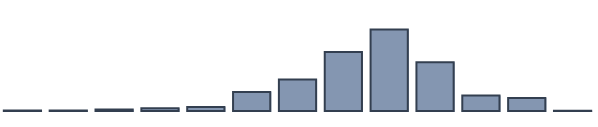
| Category | Series 0 |
|---|---|
| 0 | 0.169 |
| 1 | 0.136 |
| 2 | 0.545 |
| 3 | 0.969 |
| 4 | 1.447 |
| 5 | 6.848 |
| 6 | 11.373 |
| 7 | 21.242 |
| 8 | 29.33 |
| 9 | 17.587 |
| 10 | 5.615 |
| 11 | 4.687 |
| 12 | 0.052 |